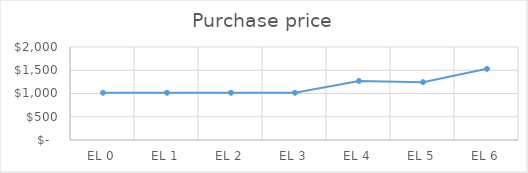
| Category |           Purchase price |
|---|---|
| EL 0 | 1015.816 |
| EL 1 | 1015.816 |
| EL 2 | 1015.816 |
| EL 3 | 1015.816 |
| EL 4 | 1269.665 |
| EL 5 | 1244.346 |
| EL 6 | 1530.212 |